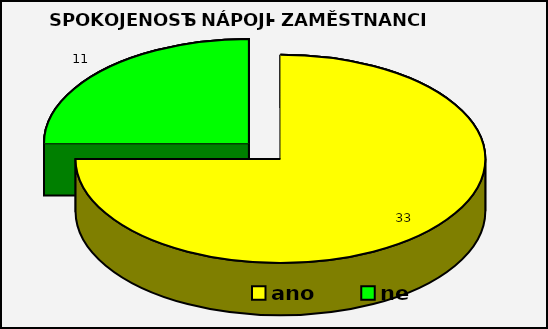
| Category | Series 0 |
|---|---|
| ano | 33 |
| ne | 11 |